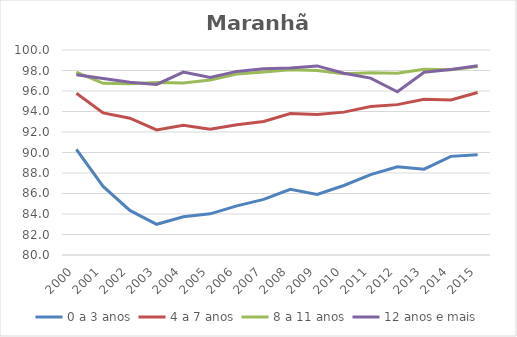
| Category | 0 a 3 anos | 4 a 7 anos | 8 a 11 anos | 12 anos e mais |
|---|---|---|---|---|
| 2000.0 | 90.308 | 95.781 | 97.851 | 97.596 |
| 2001.0 | 86.692 | 93.866 | 96.749 | 97.216 |
| 2002.0 | 84.352 | 93.349 | 96.71 | 96.859 |
| 2003.0 | 82.995 | 92.198 | 96.822 | 96.647 |
| 2004.0 | 83.733 | 92.661 | 96.778 | 97.843 |
| 2005.0 | 84.013 | 92.279 | 97.07 | 97.321 |
| 2006.0 | 84.797 | 92.71 | 97.664 | 97.911 |
| 2007.0 | 85.427 | 93.022 | 97.861 | 98.177 |
| 2008.0 | 86.41 | 93.807 | 98.069 | 98.247 |
| 2009.0 | 85.913 | 93.705 | 97.994 | 98.449 |
| 2010.0 | 86.781 | 93.939 | 97.684 | 97.731 |
| 2011.0 | 87.847 | 94.486 | 97.792 | 97.261 |
| 2012.0 | 88.616 | 94.671 | 97.741 | 95.928 |
| 2013.0 | 88.377 | 95.196 | 98.126 | 97.831 |
| 2014.0 | 89.623 | 95.119 | 98.071 | 98.108 |
| 2015.0 | 89.784 | 95.848 | 98.378 | 98.473 |